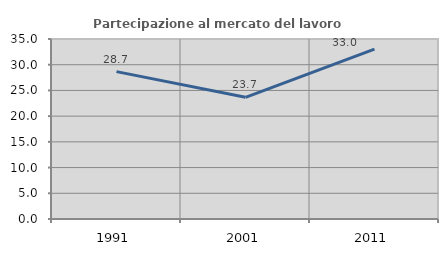
| Category | Partecipazione al mercato del lavoro  femminile |
|---|---|
| 1991.0 | 28.651 |
| 2001.0 | 23.664 |
| 2011.0 | 33.016 |